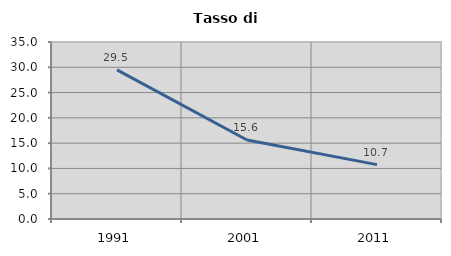
| Category | Tasso di disoccupazione   |
|---|---|
| 1991.0 | 29.479 |
| 2001.0 | 15.622 |
| 2011.0 | 10.748 |